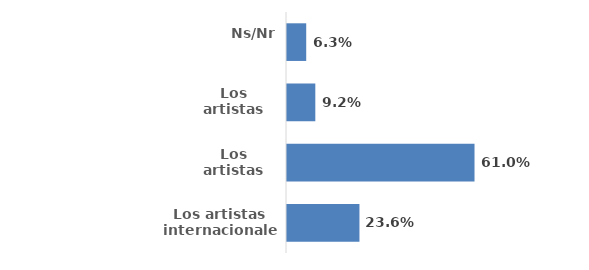
| Category | Series 0 |
|---|---|
| Los artistas internacionales | 0.236 |
| Los artistas nacionales | 0.61 |
| Los artistas distritales  | 0.092 |
| Ns/Nr | 0.062 |